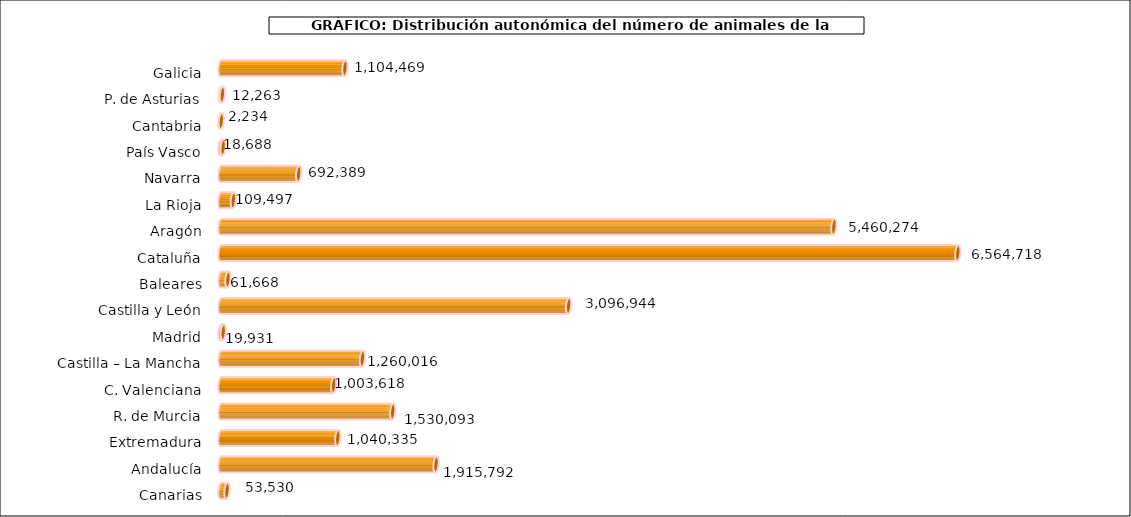
| Category | num. Animales |
|---|---|
| 0 | 1104469 |
| 1 | 12263 |
| 2 | 2234 |
| 3 | 18688 |
| 4 | 692389 |
| 5 | 109497 |
| 6 | 5460274 |
| 7 | 6564718 |
| 8 | 61668 |
| 9 | 3096944 |
| 10 | 19931 |
| 11 | 1260016 |
| 12 | 1003618 |
| 13 | 1530093 |
| 14 | 1040335 |
| 15 | 1915792 |
| 16 | 53530 |